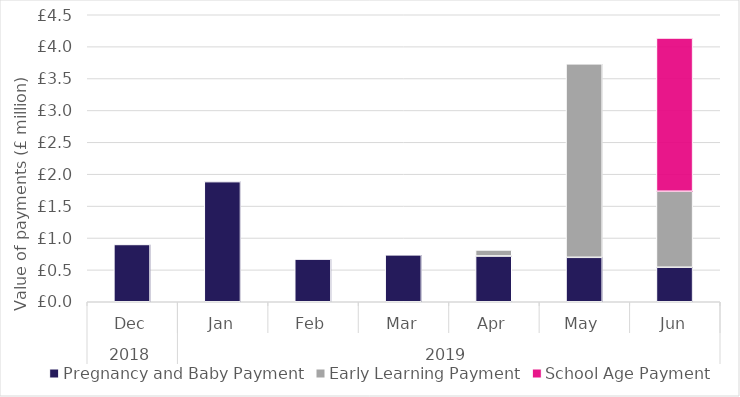
| Category | Pregnancy and Baby Payment | Early Learning Payment | School Age Payment |
|---|---|---|---|
| 0 | 898200 | 0 | 0 |
| 1 | 1883700 | 0 | 0 |
| 2 | 668700 | 0 | 0 |
| 3 | 735000 | 0 | 0 |
| 4 | 717300 | 95250 | 0 |
| 5 | 696600 | 3033750 | 0 |
| 6 | 540900 | 1191250 | 2403750 |